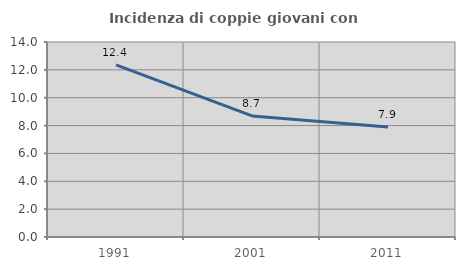
| Category | Incidenza di coppie giovani con figli |
|---|---|
| 1991.0 | 12.361 |
| 2001.0 | 8.696 |
| 2011.0 | 7.893 |